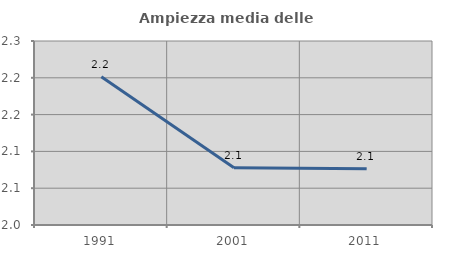
| Category | Ampiezza media delle famiglie |
|---|---|
| 1991.0 | 2.201 |
| 2001.0 | 2.078 |
| 2011.0 | 2.076 |